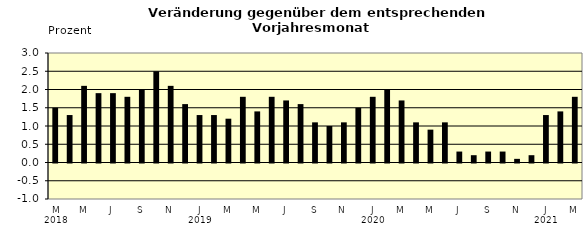
| Category | Series 0 |
|---|---|
| 0 | 1.5 |
| 1 | 1.3 |
| 2 | 2.1 |
| 3 | 1.9 |
| 4 | 1.9 |
| 5 | 1.8 |
| 6 | 2 |
| 7 | 2.5 |
| 8 | 2.1 |
| 9 | 1.6 |
| 10 | 1.3 |
| 11 | 1.3 |
| 12 | 1.2 |
| 13 | 1.8 |
| 14 | 1.4 |
| 15 | 1.8 |
| 16 | 1.7 |
| 17 | 1.6 |
| 18 | 1.1 |
| 19 | 1 |
| 20 | 1.1 |
| 21 | 1.5 |
| 22 | 1.8 |
| 23 | 2 |
| 24 | 1.7 |
| 25 | 1.1 |
| 26 | 0.9 |
| 27 | 1.1 |
| 28 | 0.3 |
| 29 | 0.2 |
| 30 | 0.3 |
| 31 | 0.3 |
| 32 | 0.1 |
| 33 | 0.2 |
| 34 | 1.3 |
| 35 | 1.4 |
| 36 | 1.8 |